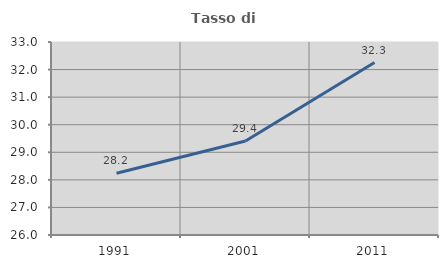
| Category | Tasso di occupazione   |
|---|---|
| 1991.0 | 28.238 |
| 2001.0 | 29.412 |
| 2011.0 | 32.256 |